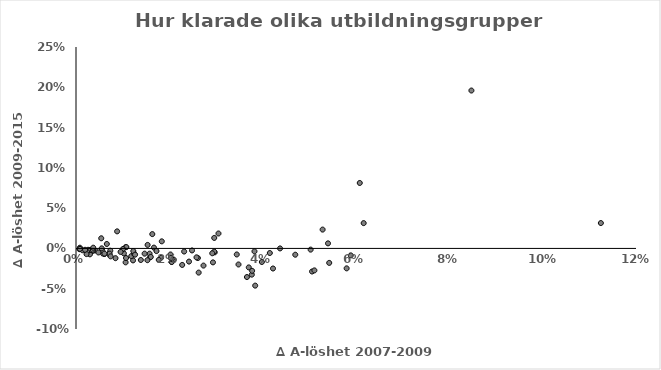
| Category | Series 0 |
|---|---|
| 0.02972307889547761 | -0.005 |
| 0.08473133387926739 | 0.196 |
| 0.05400373469237489 | 0.006 |
| 0.03824508236690744 | -0.004 |
| 0.026117763445578784 | -0.012 |
| 0.05284706744499475 | 0.023 |
| 0.02051744494268715 | -0.017 |
| 0.004054071981447492 | -0.002 |
| 0.006077685697044121 | -0.007 |
| 0.0032743799285561764 | -0.004 |
| 0.005733697898749963 | -0.006 |
| 0.0013669477719000052 | -0.002 |
| 0.0035148255822953726 | -0.002 |
| 0.06164544500686327 | 0.031 |
| 0.05058069397927534 | -0.029 |
| 0.03840053298502818 | -0.046 |
| 0.027320241418430945 | -0.021 |
| 0.029606126275903782 | -0.004 |
| 0.03444792145089139 | -0.007 |
| 0.026285581467490243 | -0.03 |
| 0.007005425313173521 | -0.007 |
| 0.060806381618464106 | 0.081 |
| 0.010261445600614493 | -0.006 |
| 0.02919800089230387 | -0.006 |
| 0.013889865921083305 | -0.014 |
| 0.012221037167412001 | -0.015 |
| 0.01534577843932099 | 0.004 |
| 0.01063227495559732 | -0.017 |
| 0.0036194258924038564 | -0.003 |
| 0.01588833228139122 | -0.011 |
| 0.0029796919224416296 | -0.007 |
| 0.01063519436012083 | 0.002 |
| 0.030531827253991485 | 0.019 |
| 0.050280972180228006 | -0.001 |
| 0.018227372311451627 | -0.012 |
| 0.011843575765726401 | -0.009 |
| 0.016699634093925598 | 0.001 |
| 0.010792052259118126 | 0.002 |
| 0.015764189442862342 | -0.007 |
| 0.01006577401926239 | -0.001 |
| 0.01724492472411483 | -0.003 |
| 0.043726034026954234 | 0 |
| 0.11247088225906132 | 0.031 |
| 0.009555030554261271 | -0.004 |
| 0.03482139313674665 | -0.02 |
| 0.037022504362667435 | -0.024 |
| 0.042215701170759554 | -0.025 |
| 0.05108534191107892 | -0.027 |
| 0.025825170958644714 | -0.011 |
| 0.04698831024713052 | -0.008 |
| 0.020512562572271527 | -0.017 |
| 0.02421520936868359 | -0.016 |
| 0.012494470781355616 | -0.007 |
| 0.0029892401503977366 | -0.002 |
| 0.003557131813317486 | -0.002 |
| 0.005636312292357377 | -0.003 |
| 0.003695418725591827 | 0.001 |
| 0.002585955558312286 | -0.002 |
| 0.041531654707371524 | -0.006 |
| 0.014704891696378723 | -0.006 |
| 0.02094355593839507 | -0.014 |
| 0.012285677261942886 | -0.003 |
| 0.020520880648899186 | -0.013 |
| 0.05887751615707573 | -0.009 |
| 0.05799443588668788 | -0.025 |
| 0.02935163985727019 | -0.017 |
| 0.016018279863018025 | -0.011 |
| 0.005408543777518919 | 0.013 |
| 0.007346910717372495 | -0.003 |
| 0.0008313795240790147 | 0.001 |
| 0.029620749343694956 | 0.013 |
| 0.037671934914770236 | -0.033 |
| 0.02025047419303225 | -0.008 |
| 0.004809519983614414 | -0.005 |
| 0.015301688491802891 | -0.015 |
| 0.012661142368155503 | -0.008 |
| 0.008462572316684246 | -0.012 |
| 0.0023557444936729063 | -0.004 |
| 0.017736660223109903 | -0.014 |
| 0.006605476427443248 | 0.006 |
| 0.007205607396846266 | -0.007 |
| 0.002252145678023806 | -0.007 |
| 0.0019532624441894204 | -0.002 |
| 0.00551008314243418 | 0 |
| 0.010721031213331107 | -0.012 |
| 0.007415289725144101 | -0.01 |
| 0.0007263398707456166 | -0.001 |
| 0.006100911291438579 | -0.006 |
| 0.008812234071310892 | 0.021 |
| 0.01838335711521223 | 0.009 |
| 0.037740483507975583 | -0.028 |
| 0.03983015488433376 | -0.017 |
| 0.024862949043663103 | -0.002 |
| 0.022754449426802645 | -0.02 |
| 0.0008465689382435666 | -0.001 |
| 0.020306160776270135 | -0.012 |
| 0.02317429677563422 | -0.004 |
| 0.03662794235194109 | -0.036 |
| 0.05426072851289948 | -0.018 |
| 0.01634871004755779 | 0.018 |